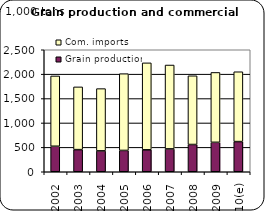
| Category | Grain production | Com. imports |
|---|---|---|
| 2002 | 522.804 | 1440.666 |
| 2003 | 453.641 | 1285.572 |
| 2004 | 427.955 | 1275.792 |
| 2005 | 436.799 | 1572.856 |
| 2006 | 449.312 | 1782.108 |
| 2007 | 468.312 | 1718.946 |
| 2008 | 558.48 | 1408.14 |
| 2009 | 603.02 | 1432.169 |
| 2010(e) | 618.2 | 1431.103 |